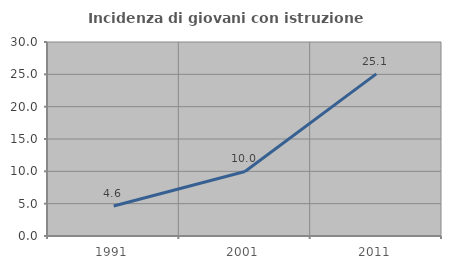
| Category | Incidenza di giovani con istruzione universitaria |
|---|---|
| 1991.0 | 4.639 |
| 2001.0 | 9.976 |
| 2011.0 | 25.067 |